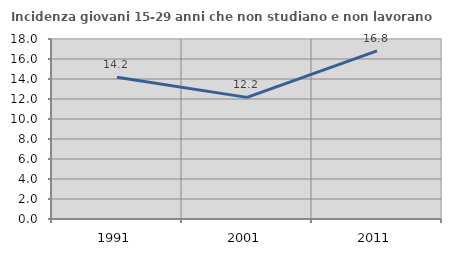
| Category | Incidenza giovani 15-29 anni che non studiano e non lavorano  |
|---|---|
| 1991.0 | 14.184 |
| 2001.0 | 12.163 |
| 2011.0 | 16.812 |